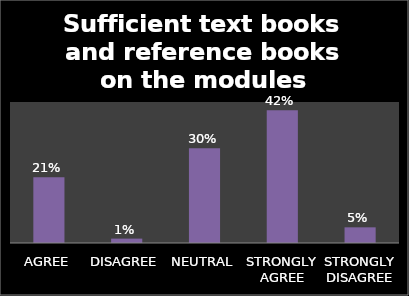
| Category | Series 0 |
|---|---|
| AGREE | 0.21 |
| DISAGREE | 0.014 |
| NEUTRAL | 0.302 |
| STRONGLY AGREE | 0.424 |
| STRONGLY DISAGREE | 0.05 |